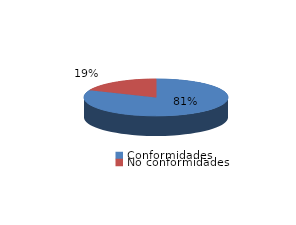
| Category | Series 0 |
|---|---|
| Conformidades | 892 |
| No conformidades | 204 |